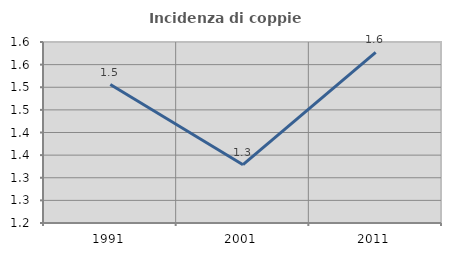
| Category | Incidenza di coppie miste |
|---|---|
| 1991.0 | 1.506 |
| 2001.0 | 1.329 |
| 2011.0 | 1.577 |